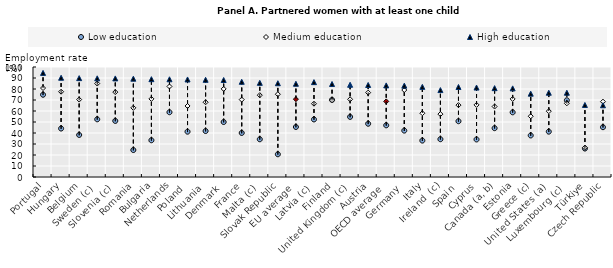
| Category | Low education | Medium education | High education |
|---|---|---|---|
| Portugal | 74.781 | 80.874 | 94.634 |
| Hungary | 44.067 | 77.527 | 90.219 |
| Belgium | 38.238 | 70.408 | 89.879 |
| Sweden (c) | 52.448 | 84.958 | 89.706 |
| Slovenia (c) | 50.98 | 77.187 | 89.617 |
| Romania | 24.518 | 62.892 | 89.383 |
| Bulgaria | 33.397 | 71.013 | 88.943 |
| Netherlands | 58.887 | 82.308 | 88.837 |
| Poland | 41.2 | 64.574 | 88.67 |
| Lithuania | 41.778 | 67.954 | 88.361 |
| Denmark | 49.975 | 80.09 | 88.179 |
| France | 40.049 | 70.362 | 86.553 |
| Malta (c) | 34.304 | 74.403 | 85.594 |
| Slovak Republic | 20.662 | 75.255 | 85.233 |
| EU average | 45.471 | 70.762 | 84.751 |
| Latvia (c) | 52.323 | 66.625 | 86.246 |
| Finland | 70.102 | 69.876 | 84.557 |
| United Kingdom (c) | 54.655 | 70.597 | 83.847 |
| Austria | 48.418 | 76.708 | 83.643 |
| OECD average | 47.001 | 68.73 | 83.27 |
| Germany | 42.178 | 79.085 | 83.057 |
| Italy | 33.104 | 57.982 | 81.935 |
| Ireland  (c) | 34.37 | 57.148 | 79.016 |
| Spain | 50.71 | 65.335 | 81.819 |
| Cyprus | 34.141 | 65.578 | 81.309 |
| Canada (a, b) | 44.397 | 64.066 | 80.794 |
| Estonia | 58.801 | 70.954 | 80.579 |
| Greece (c) | 37.773 | 55.23 | 75.757 |
| United States (a) | 41.218 | 59.851 | 76.613 |
| Luxembourg (c) | 69.769 | 67.007 | 76.591 |
| Türkiye | 25.874 | 26.539 | 65.474 |
| Czech Republic | 45.284 | 68.491 | 65.203 |